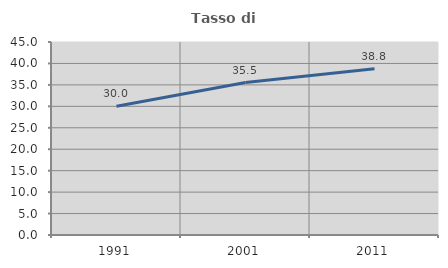
| Category | Tasso di occupazione   |
|---|---|
| 1991.0 | 30.028 |
| 2001.0 | 35.537 |
| 2011.0 | 38.76 |